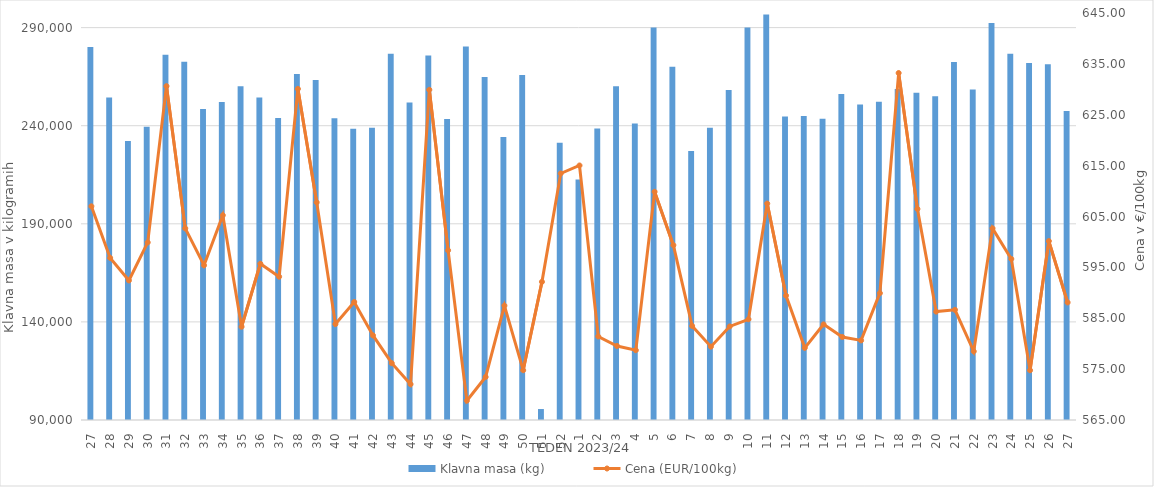
| Category | Klavna masa (kg) |
|---|---|
| 27.0 | 280112 |
| 28.0 | 254336 |
| 29.0 | 232178 |
| 30.0 | 239437 |
| 31.0 | 276163 |
| 32.0 | 272647 |
| 33.0 | 248536 |
| 34.0 | 252050 |
| 35.0 | 260110 |
| 36.0 | 254389 |
| 37.0 | 243933 |
| 38.0 | 266321 |
| 39.0 | 263346 |
| 40.0 | 243765 |
| 41.0 | 238404 |
| 42.0 | 239007 |
| 43.0 | 276684 |
| 44.0 | 251832 |
| 45.0 | 275816 |
| 46.0 | 243425 |
| 47.0 | 280350 |
| 48.0 | 264849 |
| 49.0 | 234308 |
| 50.0 | 265786 |
| 51.0 | 95590 |
| 52.0 | 231370 |
| 1.0 | 212581 |
| 2.0 | 238607 |
| 3.0 | 260140 |
| 4.0 | 241148 |
| 5.0 | 290049 |
| 6.0 | 270025 |
| 7.0 | 227057 |
| 8.0 | 238927 |
| 9.0 | 258215 |
| 10.0 | 290025 |
| 11.0 | 296713 |
| 12.0 | 244673 |
| 13.0 | 244902 |
| 14.0 | 243567 |
| 15.0 | 256150 |
| 16.0 | 250753 |
| 17.0 | 252214 |
| 18.0 | 258692 |
| 19.0 | 256770 |
| 20.0 | 254959 |
| 21.0 | 272478 |
| 22.0 | 258397 |
| 23.0 | 292355 |
| 24.0 | 276652 |
| 25.0 | 272001 |
| 26.0 | 271320 |
| 27.0 | 247523 |